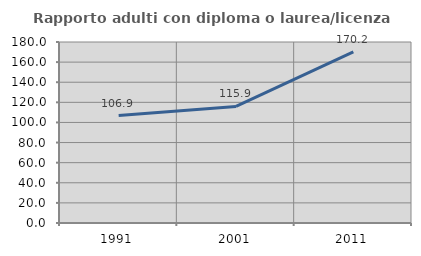
| Category | Rapporto adulti con diploma o laurea/licenza media  |
|---|---|
| 1991.0 | 106.905 |
| 2001.0 | 115.937 |
| 2011.0 | 170.229 |